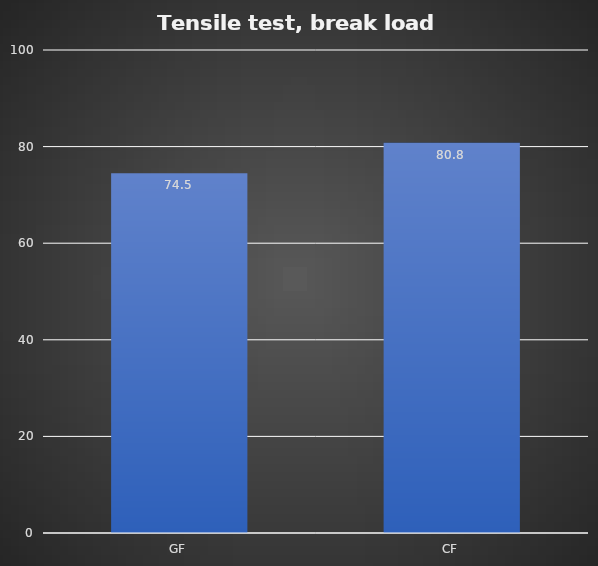
| Category | Average (kg) |
|---|---|
| GF | 74.5 |
| CF | 80.8 |